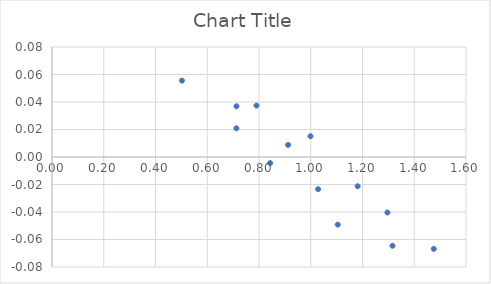
| Category | Series 0 |
|---|---|
| 0.712970090354104 | 0.037 |
| 0.9124359323374 | 0.009 |
| 1.10412953739279 | -0.049 |
| 1.296261068162752 | -0.04 |
| 0.502092357575324 | 0.056 |
| 0.790290163841932 | 0.037 |
| 0.99899228310595 | 0.015 |
| 1.181229816182052 | -0.021 |
| 1.475469658800346 | -0.067 |
| 1.315949569617278 | -0.065 |
| 1.028477271041602 | -0.023 |
| 0.843034386975377 | -0.004 |
| 0.712546736446516 | 0.021 |